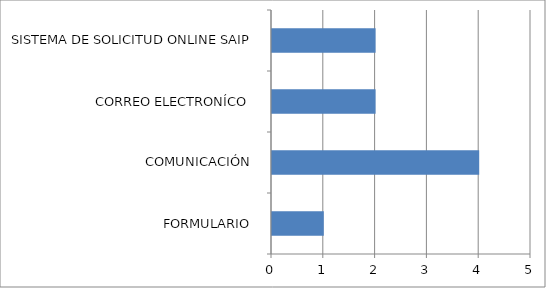
| Category | Series 0 |
|---|---|
| FORMULARIO  | 1 |
| COMUNICACIÓN  | 4 |
| CORREO ELECTRONÍCO  | 2 |
| SISTEMA DE SOLICITUD ONLINE SAIP | 2 |